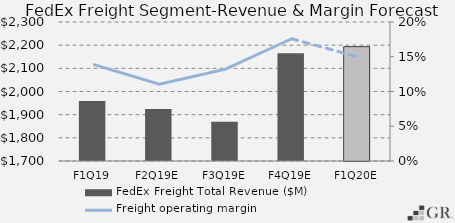
| Category | FedEx Freight Total Revenue ($M) |
|---|---|
|  F1Q19  | 1959.025 |
|  F2Q19E  | 1924.188 |
|  F3Q19E  | 1869.697 |
|  F4Q19E  | 2165.438 |
|  F1Q20E  | 2193.512 |